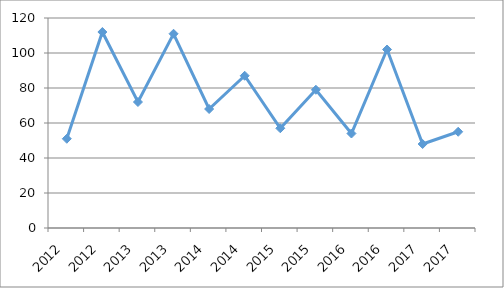
| Category | CAAV-F2O43 |
|---|---|
| 2012.0 | 51 |
| 2012.0 | 112 |
| 2013.0 | 72 |
| 2013.0 | 111 |
| 2014.0 | 68 |
| 2014.0 | 87 |
| 2015.0 | 57 |
| 2015.0 | 79 |
| 2016.0 | 54 |
| 2016.0 | 102 |
| 2017.0 | 48 |
| 2017.0 | 55 |